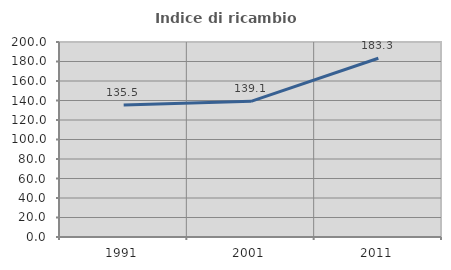
| Category | Indice di ricambio occupazionale  |
|---|---|
| 1991.0 | 135.484 |
| 2001.0 | 139.13 |
| 2011.0 | 183.333 |